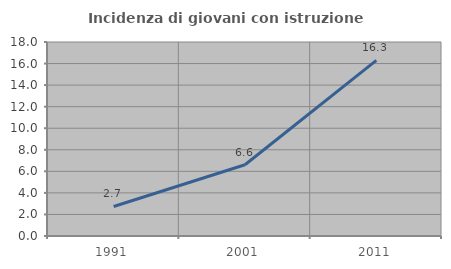
| Category | Incidenza di giovani con istruzione universitaria |
|---|---|
| 1991.0 | 2.741 |
| 2001.0 | 6.615 |
| 2011.0 | 16.297 |